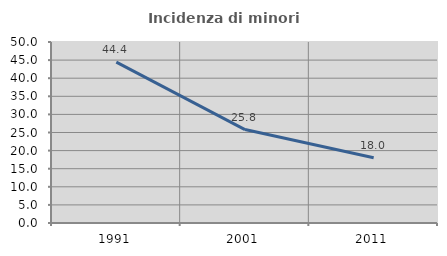
| Category | Incidenza di minori stranieri |
|---|---|
| 1991.0 | 44.444 |
| 2001.0 | 25.806 |
| 2011.0 | 18.033 |